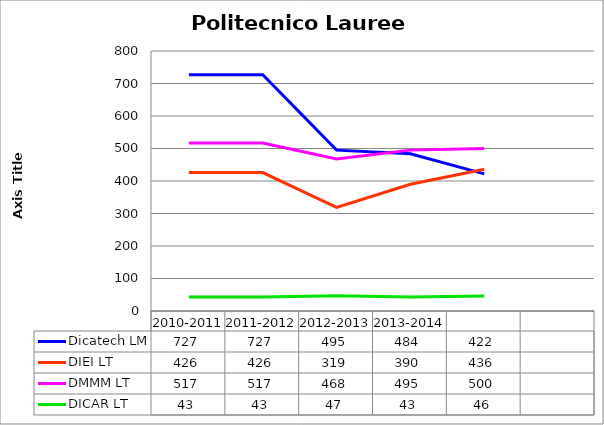
| Category | Dicatech LM | DIEI LT | DMMM LT | DICAR LT |
|---|---|---|---|---|
| 2010-2011 | 727 | 426 | 517 | 43 |
| 2011-2012 | 727 | 426 | 517 | 43 |
| 2012-2013 | 495 | 319 | 468 | 47 |
| 2013-2014 | 484 | 390 | 495 | 43 |